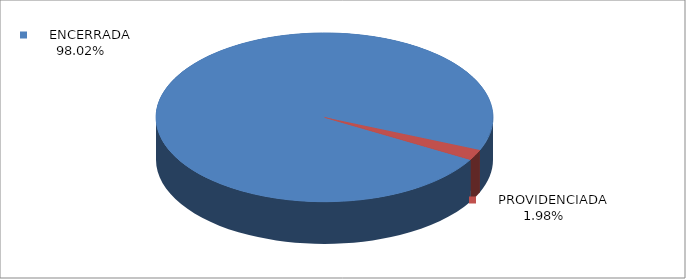
| Category | Series 0 |
|---|---|
|      ENCERRADA | 0.98 |
|      PROVIDENCIADA | 0.02 |